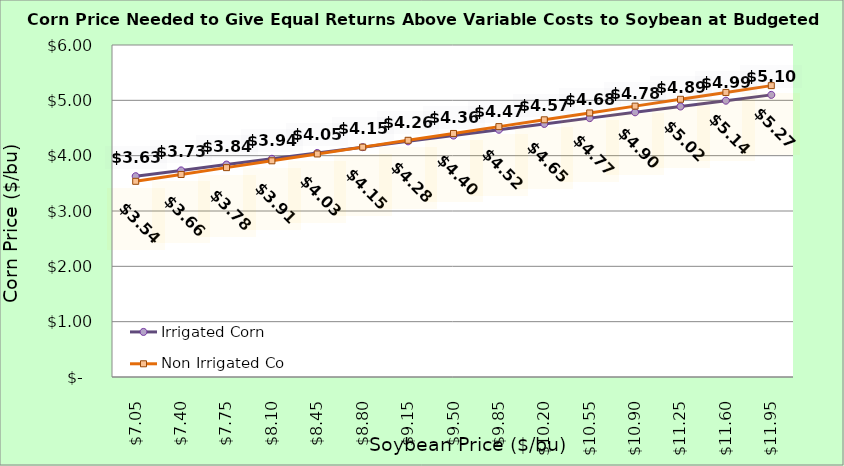
| Category | Irrigated Corn | Non Irrigated Corn |
|---|---|---|
| 7.0500000000000025 | 3.629 | 3.537 |
| 7.400000000000002 | 3.734 | 3.66 |
| 7.750000000000002 | 3.839 | 3.784 |
| 8.100000000000001 | 3.944 | 3.907 |
| 8.450000000000001 | 4.049 | 4.031 |
| 8.8 | 4.154 | 4.154 |
| 9.15 | 4.259 | 4.278 |
| 9.5 | 4.364 | 4.401 |
| 9.85 | 4.469 | 4.525 |
| 10.2 | 4.574 | 4.648 |
| 10.549999999999999 | 4.679 | 4.772 |
| 10.899999999999999 | 4.784 | 4.895 |
| 11.249999999999998 | 4.889 | 5.019 |
| 11.599999999999998 | 4.994 | 5.143 |
| 11.949999999999998 | 5.099 | 5.266 |